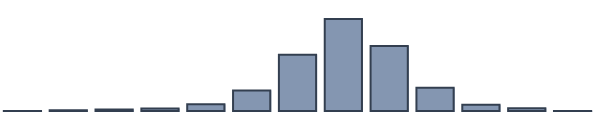
| Category | Series 0 |
|---|---|
| 0 | 0.043 |
| 1 | 0.261 |
| 2 | 0.522 |
| 3 | 0.913 |
| 4 | 2.391 |
| 5 | 7.348 |
| 6 | 20.304 |
| 7 | 33.13 |
| 8 | 23.391 |
| 9 | 8.391 |
| 10 | 2.261 |
| 11 | 1 |
| 12 | 0.043 |